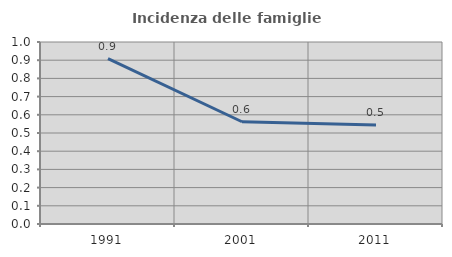
| Category | Incidenza delle famiglie numerose |
|---|---|
| 1991.0 | 0.909 |
| 2001.0 | 0.562 |
| 2011.0 | 0.543 |